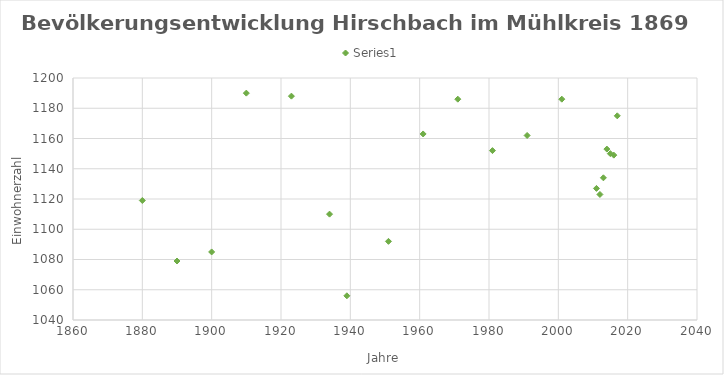
| Category | Series 0 |
|---|---|
| 1880.0 | 1119 |
| 1890.0 | 1079 |
| 1900.0 | 1085 |
| 1910.0 | 1190 |
| 1923.0 | 1188 |
| 1934.0 | 1110 |
| 1939.0 | 1056 |
| 1951.0 | 1092 |
| 1961.0 | 1163 |
| 1971.0 | 1186 |
| 1981.0 | 1152 |
| 1991.0 | 1162 |
| 2001.0 | 1186 |
| 2011.0 | 1127 |
| 2012.0 | 1123 |
| 2013.0 | 1134 |
| 2014.0 | 1153 |
| 2015.0 | 1150 |
| 2016.0 | 1149 |
| 2017.0 | 1175 |